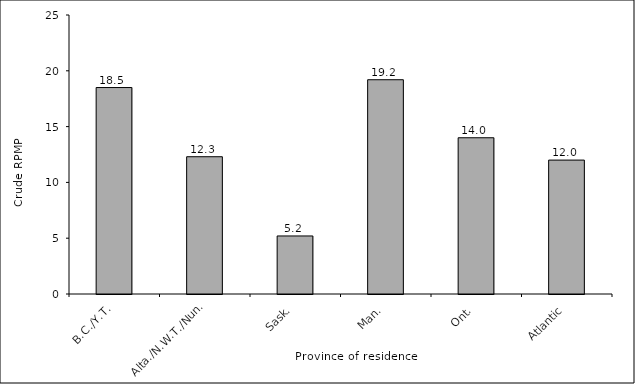
| Category | Crude RPMP |
|---|---|
| B.C./Y.T. | 18.5 |
| Alta./N.W.T./Nun. | 12.3 |
| Sask. | 5.2 |
| Man. | 19.2 |
| Ont. | 14 |
| Atlantic | 12 |